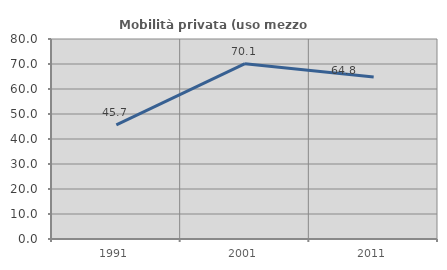
| Category | Mobilità privata (uso mezzo privato) |
|---|---|
| 1991.0 | 45.679 |
| 2001.0 | 70.13 |
| 2011.0 | 64.754 |